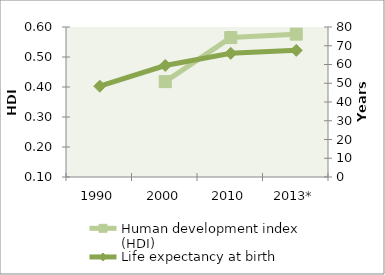
| Category | Human development index (HDI) |
|---|---|
| 1990 | 0 |
| 2000 | 0.418 |
| 2010 | 0.565 |
| 2013* | 0.576 |